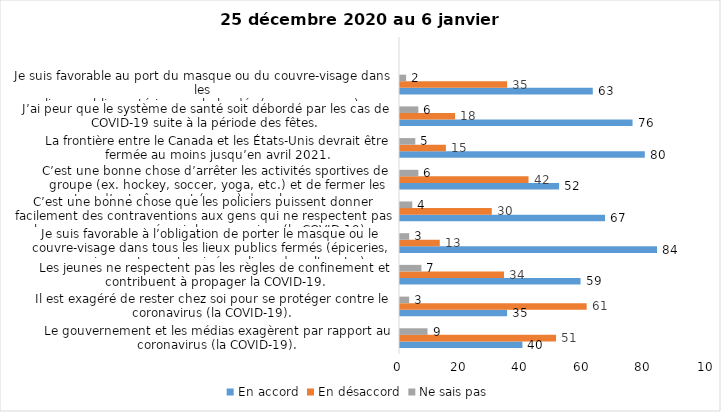
| Category | En accord | En désaccord | Ne sais pas |
|---|---|---|---|
| Le gouvernement et les médias exagèrent par rapport au coronavirus (la COVID-19). | 40 | 51 | 9 |
| Il est exagéré de rester chez soi pour se protéger contre le coronavirus (la COVID-19). | 35 | 61 | 3 |
| Les jeunes ne respectent pas les règles de confinement et contribuent à propager la COVID-19. | 59 | 34 | 7 |
| Je suis favorable à l’obligation de porter le masque ou le couvre-visage dans tous les lieux publics fermés (épiceries, magasins, restaurants, cinéma, lieux de culte, etc.). | 84 | 13 | 3 |
| C’est une bonne chose que les policiers puissent donner facilement des contraventions aux gens qui ne respectent pas les mesures pour prévenir le coronavirus (la COVID-19). | 67 | 30 | 4 |
| C’est une bonne chose d’arrêter les activités sportives de groupe (ex. hockey, soccer, yoga, etc.) et de fermer les centres d’entraînement (gyms) dans les zones rouges. | 52 | 42 | 6 |
| La frontière entre le Canada et les États-Unis devrait être fermée au moins jusqu’en avril 2021. | 80 | 15 | 5 |
| J’ai peur que le système de santé soit débordé par les cas de COVID-19 suite à la période des fêtes. | 76 | 18 | 6 |
| Je suis favorable au port du masque ou du couvre-visage dans les
lieux publics extérieurs achalandés (ex. rues, parcs) | 63 | 35 | 2 |